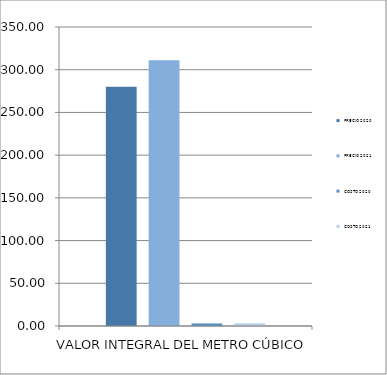
| Category | PRECIO 2020 | PRECIO 2021 | COSTO 2020 | COSTO 2021 |
|---|---|---|---|---|
| VALOR INTEGRAL DEL METRO CÚBICO | 280.187 | 311.214 | 2.988 | 3.093 |